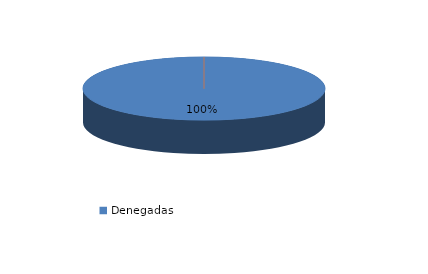
| Category | Series 0 |
|---|---|
| Denegadas | 2 |
| Adoptadas Solo Con Medidas Penales | 0 |
| Adoptadas Con Medidas Civiles Y Penales | 0 |
| Adoptadas Con Medidas Solo Civiles | 0 |